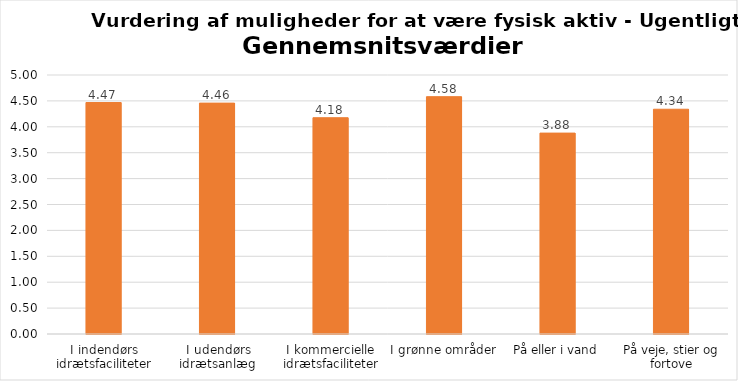
| Category | Gennemsnit |
|---|---|
| I indendørs idrætsfaciliteter | 4.469 |
| I udendørs idrætsanlæg | 4.457 |
| I kommercielle idrætsfaciliteter | 4.175 |
| I grønne områder | 4.581 |
| På eller i vand | 3.878 |
| På veje, stier og fortove | 4.339 |